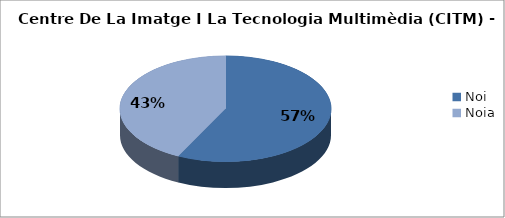
| Category | Centre De La Imatge I La Tecnologia Multimèdia (CITM) - Gènere |
|---|---|
| Noi | 0.574 |
| Noia | 0.426 |